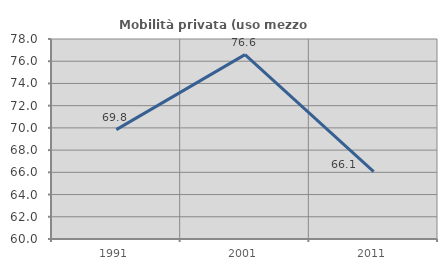
| Category | Mobilità privata (uso mezzo privato) |
|---|---|
| 1991.0 | 69.841 |
| 2001.0 | 76.596 |
| 2011.0 | 66.071 |